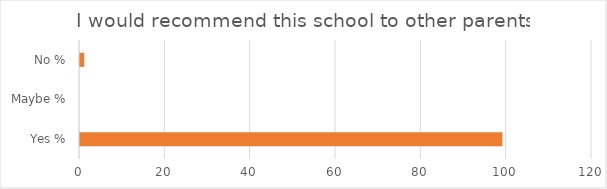
| Category | Series 0 |
|---|---|
| Yes % | 99 |
| Maybe % | 0 |
| No % | 1 |